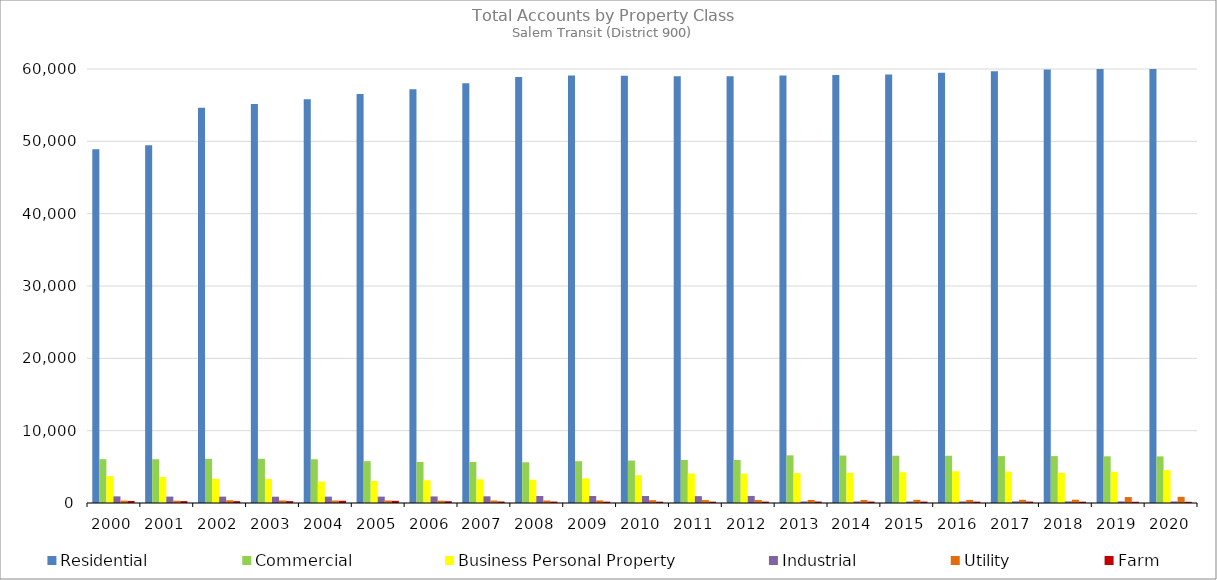
| Category | Residential | Commercial | Business Personal Property | Industrial | Utility | Farm |
|---|---|---|---|---|---|---|
| 2000.0 | 48917 | 6056 | 3714 | 917 | 331 | 285 |
| 2001.0 | 49449 | 6047 | 3594 | 888 | 317 | 264 |
| 2002.0 | 54639 | 6112 | 3342 | 881 | 378 | 256 |
| 2003.0 | 55176 | 6110 | 3316 | 872 | 351 | 258 |
| 2004.0 | 55805 | 6048 | 2960 | 880 | 341 | 312 |
| 2005.0 | 56561 | 5776 | 3050 | 881 | 344 | 299 |
| 2006.0 | 57191 | 5668 | 3137 | 907 | 320 | 251 |
| 2007.0 | 58043 | 5665 | 3273 | 924 | 343 | 210 |
| 2008.0 | 58883 | 5632 | 3220 | 971 | 342 | 195 |
| 2009.0 | 59093 | 5779 | 3404 | 972 | 355 | 187 |
| 2010.0 | 59052 | 5867 | 3848 | 972 | 394 | 186 |
| 2011.0 | 59006 | 5951 | 4074 | 949 | 401 | 185 |
| 2012.0 | 59006 | 5942 | 4056 | 977 | 407 | 193 |
| 2013.0 | 59088 | 6589 | 4127 | 213 | 420 | 200 |
| 2014.0 | 59164 | 6557 | 4177 | 211 | 416 | 199 |
| 2015.0 | 59247 | 6533 | 4252 | 209 | 439 | 194 |
| 2016.0 | 59498 | 6532 | 4387 | 214 | 421 | 189 |
| 2017.0 | 59697 | 6486 | 4342 | 223 | 440 | 194 |
| 2018.0 | 59926 | 6485 | 4172 | 224 | 456 | 183 |
| 2019.0 | 60333 | 6457 | 4319 | 226 | 822 | 168 |
| 2020.0 | 60717 | 6446 | 4541 | 216 | 851 | 165 |